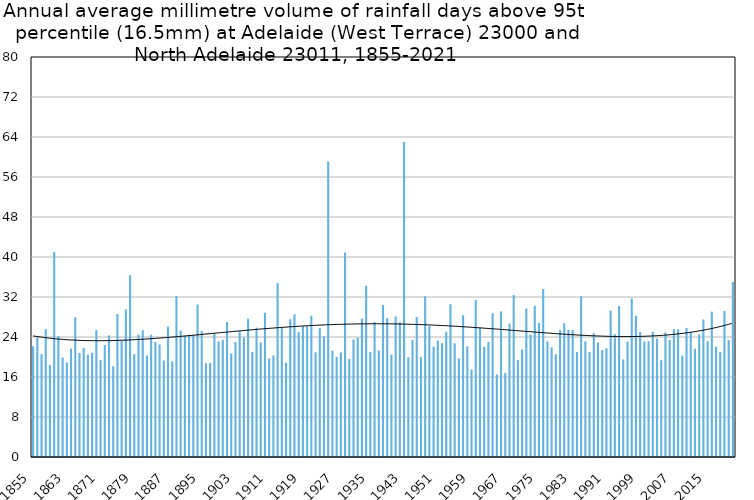
| Category | Annual average mm in days above 95th percentile |
|---|---|
| 1855 | 22.162 |
| 1856 | 23.878 |
| 1857 | 20.586 |
| 1858 | 25.557 |
| 1859 | 18.4 |
| 1860 | 40.967 |
| 1861 | 24.214 |
| 1862 | 19.886 |
| 1863 | 18.925 |
| 1864 | 21.683 |
| 1865 | 27.967 |
| 1866 | 20.817 |
| 1867 | 21.8 |
| 1868 | 20.45 |
| 1869 | 20.833 |
| 1870 | 25.378 |
| 1871 | 19.364 |
| 1872 | 22.38 |
| 1873 | 24.325 |
| 1874 | 18.15 |
| 1875 | 28.591 |
| 1876 | 23.2 |
| 1877 | 29.5 |
| 1878 | 36.36 |
| 1879 | 20.571 |
| 1880 | 24.48 |
| 1881 | 25.375 |
| 1882 | 20.3 |
| 1883 | 24.45 |
| 1884 | 22.983 |
| 1885 | 22.5 |
| 1886 | 19.3 |
| 1887 | 26.1 |
| 1888 | 19.133 |
| 1889 | 32.177 |
| 1890 | 25.278 |
| 1891 | 24.25 |
| 1892 | 24.45 |
| 1893 | 24.317 |
| 1894 | 30.5 |
| 1895 | 25.183 |
| 1896 | 18.757 |
| 1897 | 18.8 |
| 1898 | 24.675 |
| 1899 | 23.12 |
| 1900 | 23.42 |
| 1901 | 27 |
| 1902 | 20.7 |
| 1903 | 23 |
| 1904 | 25.14 |
| 1905 | 23.886 |
| 1906 | 27.678 |
| 1907 | 21 |
| 1908 | 25.88 |
| 1909 | 22.9 |
| 1910 | 28.85 |
| 1911 | 19.7 |
| 1912 | 20.3 |
| 1913 | 34.8 |
| 1914 | 25.8 |
| 1915 | 18.9 |
| 1916 | 27.55 |
| 1917 | 28.557 |
| 1918 | 24.975 |
| 1919 | 26.16 |
| 1920 | 26.118 |
| 1921 | 28.256 |
| 1922 | 20.938 |
| 1923 | 25.75 |
| 1924 | 24.138 |
| 1925 | 59.1 |
| 1926 | 21.25 |
| 1927 | 20.02 |
| 1928 | 20.917 |
| 1929 | 40.9 |
| 1930 | 19.6 |
| 1931 | 23.5 |
| 1932 | 23.857 |
| 1933 | 27.657 |
| 1934 | 34.225 |
| 1935 | 20.983 |
| 1936 | 27 |
| 1937 | 21.288 |
| 1938 | 30.4 |
| 1939 | 27.786 |
| 1940 | 20.45 |
| 1941 | 28.1 |
| 1942 | 26.94 |
| 1943 | 63 |
| 1944 | 19.986 |
| 1945 | 23.45 |
| 1946 | 28 |
| 1947 | 19.975 |
| 1948 | 32.117 |
| 1949 | 26.183 |
| 1950 | 22.1 |
| 1951 | 23.283 |
| 1952 | 22.767 |
| 1953 | 25.067 |
| 1954 | 30.55 |
| 1955 | 22.757 |
| 1956 | 19.711 |
| 1957 | 28.36 |
| 1958 | 22.15 |
| 1959 | 17.5 |
| 1960 | 31.417 |
| 1961 | 25.833 |
| 1962 | 22.04 |
| 1963 | 23.047 |
| 1964 | 28.75 |
| 1965 | 16.5 |
| 1966 | 29.125 |
| 1967 | 16.8 |
| 1968 | 26.686 |
| 1969 | 32.38 |
| 1970 | 19.375 |
| 1971 | 21.483 |
| 1972 | 29.7 |
| 1973 | 24.48 |
| 1974 | 30.233 |
| 1975 | 26.8 |
| 1976 | 33.6 |
| 1977 | 23.133 |
| 1978 | 21.927 |
| 1979 | 20.583 |
| 1980 | 25.357 |
| 1981 | 26.764 |
| 1982 | 25.467 |
| 1983 | 25.4 |
| 1984 | 21.029 |
| 1985 | 32.15 |
| 1986 | 23.14 |
| 1987 | 21 |
| 1988 | 24.743 |
| 1989 | 22.9 |
| 1990 | 21.383 |
| 1991 | 21.733 |
| 1992 | 29.273 |
| 1993 | 24.55 |
| 1994 | 30.2 |
| 1995 | 19.533 |
| 1996 | 23.086 |
| 1997 | 31.714 |
| 1998 | 28.25 |
| 1999 | 25 |
| 2000 | 23.111 |
| 2001 | 23.129 |
| 2002 | 25.05 |
| 2003 | 23.667 |
| 2004 | 19.35 |
| 2005 | 24.925 |
| 2006 | 23.4 |
| 2007 | 25.571 |
| 2008 | 25.5 |
| 2009 | 20.267 |
| 2010 | 25.829 |
| 2011 | 24.9 |
| 2012 | 21.667 |
| 2013 | 24.489 |
| 2014 | 27.514 |
| 2015 | 23.16 |
| 2016 | 29.073 |
| 2017 | 22.05 |
| 2018 | 21 |
| 2019 | 29.2 |
| 2020 | 23.4 |
| 2021 | 35 |